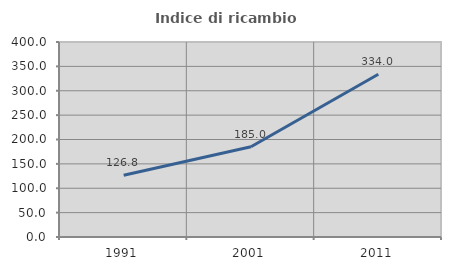
| Category | Indice di ricambio occupazionale  |
|---|---|
| 1991.0 | 126.804 |
| 2001.0 | 185 |
| 2011.0 | 333.962 |